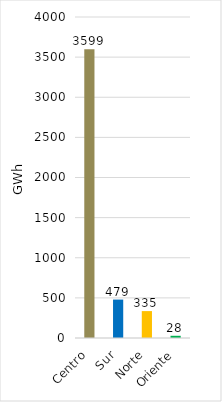
| Category | Series 0 |
|---|---|
| Centro | 3598.874 |
| Sur | 478.82 |
| Norte | 335.275 |
| Oriente | 27.625 |